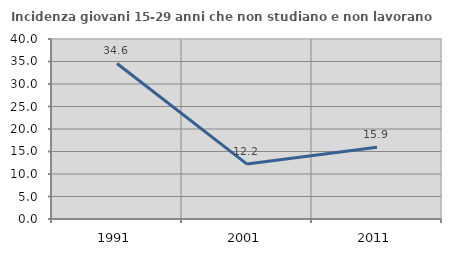
| Category | Incidenza giovani 15-29 anni che non studiano e non lavorano  |
|---|---|
| 1991.0 | 34.561 |
| 2001.0 | 12.208 |
| 2011.0 | 15.936 |